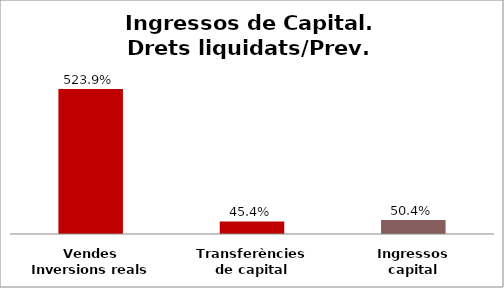
| Category | Series 0 |
|---|---|
| Vendes Inversions reals | 5.239 |
| Transferències de capital | 0.454 |
| Ingressos capital | 0.504 |